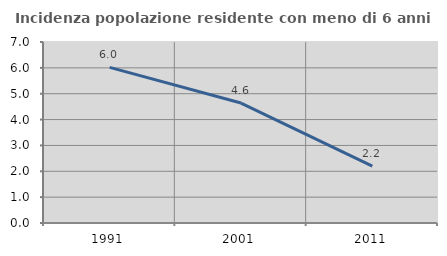
| Category | Incidenza popolazione residente con meno di 6 anni |
|---|---|
| 1991.0 | 6.019 |
| 2001.0 | 4.639 |
| 2011.0 | 2.198 |